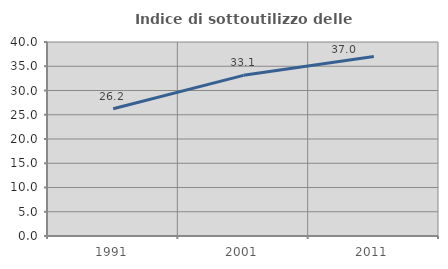
| Category | Indice di sottoutilizzo delle abitazioni  |
|---|---|
| 1991.0 | 26.247 |
| 2001.0 | 33.123 |
| 2011.0 | 37.014 |